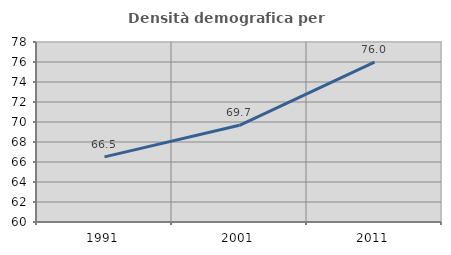
| Category | Densità demografica |
|---|---|
| 1991.0 | 66.51 |
| 2001.0 | 69.669 |
| 2011.0 | 75.987 |